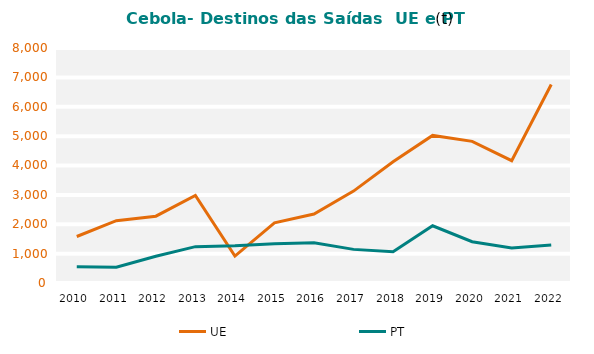
| Category | UE | PT |
|---|---|---|
| 2010.0 | 1583.496 | 556.086 |
| 2011.0 | 2121.844 | 536.146 |
| 2012.0 | 2274.613 | 909.855 |
| 2013.0 | 2979.988 | 1237.842 |
| 2014.0 | 916.107 | 1268.931 |
| 2015.0 | 2049.625 | 1336.685 |
| 2016.0 | 2350.037 | 1370.806 |
| 2017.0 | 3127.996 | 1144.498 |
| 2018.0 | 4124.743 | 1062.323 |
| 2019.0 | 5024.154 | 1948.369 |
| 2020.0 | 4821.68 | 1405.773 |
| 2021.0 | 4162.655 | 1195.833 |
| 2022.0 | 6757.503 | 1296.017 |